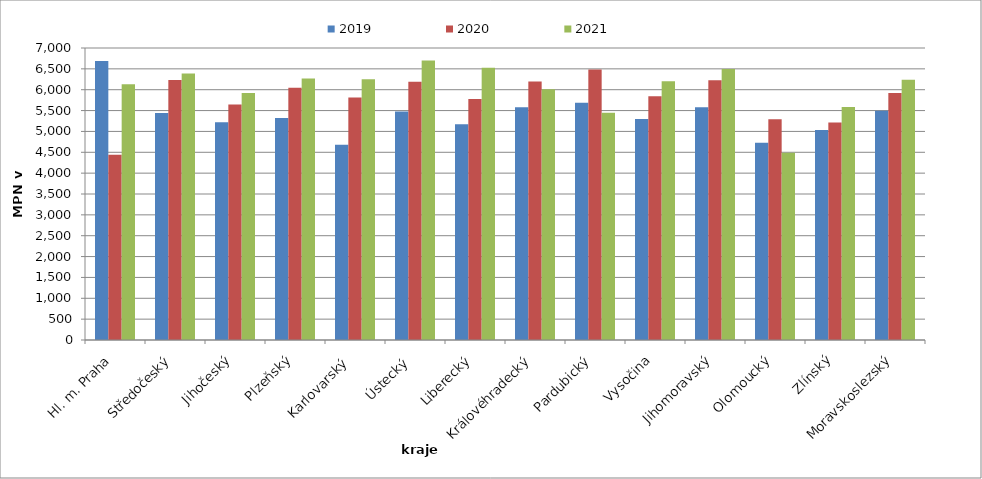
| Category | 2019 | 2020 | 2021 |
|---|---|---|---|
| Hl. m. Praha | 6690 | 4442 | 6128.744 |
| Středočeský | 5441 | 6233 | 6390.642 |
| Jihočeský | 5220 | 5643 | 5918.711 |
| Plzeňský | 5319 | 6048 | 6267.245 |
| Karlovarský  | 4681 | 5813 | 6250.221 |
| Ústecký   | 5478 | 6193 | 6700.396 |
| Liberecký | 5170 | 5779 | 6527.903 |
| Královéhradecký | 5582 | 6195 | 6013.227 |
| Pardubický | 5687 | 6482 | 5445.743 |
| Vysočina | 5298 | 5846 | 6203.679 |
| Jihomoravský | 5581 | 6224 | 6494.118 |
| Olomoucký | 4731 | 5290 | 4490.726 |
| Zlínský | 5034 | 5216 | 5586.684 |
| Moravskoslezský | 5497 | 5923 | 6239.604 |